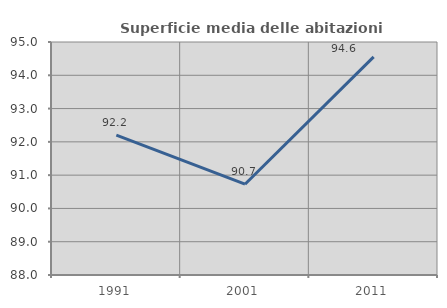
| Category | Superficie media delle abitazioni occupate |
|---|---|
| 1991.0 | 92.2 |
| 2001.0 | 90.727 |
| 2011.0 | 94.553 |